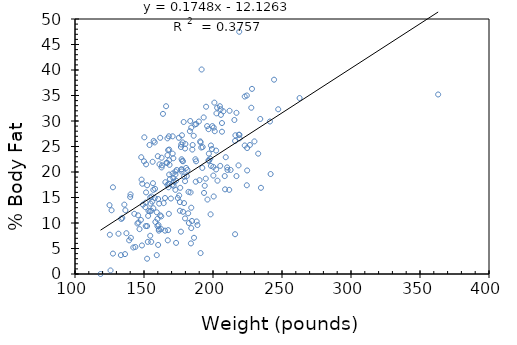
| Category | Series 0 |
|---|---|
| 154.25 | 12.3 |
| 173.25 | 6.1 |
| 154.0 | 25.3 |
| 184.75 | 10.4 |
| 184.25 | 28.7 |
| 210.25 | 20.9 |
| 181.0 | 19.2 |
| 176.0 | 12.4 |
| 191.0 | 4.1 |
| 198.25 | 11.7 |
| 186.25 | 7.1 |
| 216.0 | 7.8 |
| 180.5 | 20.8 |
| 205.25 | 21.2 |
| 187.75 | 22.1 |
| 162.75 | 20.9 |
| 195.75 | 29 |
| 209.25 | 22.9 |
| 183.75 | 16 |
| 211.75 | 16.5 |
| 179.0 | 19.1 |
| 200.5 | 15.2 |
| 140.25 | 15.6 |
| 148.75 | 17.7 |
| 151.25 | 14 |
| 159.25 | 3.7 |
| 131.5 | 7.9 |
| 148.0 | 22.9 |
| 133.25 | 3.7 |
| 160.75 | 8.8 |
| 182.0 | 11.9 |
| 160.25 | 5.7 |
| 168.0 | 11.8 |
| 218.5 | 21.3 |
| 247.25 | 32.3 |
| 191.75 | 40.1 |
| 202.25 | 24.2 |
| 196.75 | 28.4 |
| 363.15 | 35.2 |
| 203.0 | 32.6 |
| 262.75 | 34.5 |
| 205.0 | 32.9 |
| 217.0 | 31.6 |
| 212.0 | 32 |
| 125.25 | 7.7 |
| 164.25 | 13.9 |
| 133.5 | 10.8 |
| 148.5 | 5.6 |
| 135.75 | 13.6 |
| 127.5 | 4 |
| 158.25 | 10.2 |
| 139.25 | 6.6 |
| 137.25 | 8 |
| 152.75 | 6.3 |
| 136.25 | 3.9 |
| 198.0 | 22.6 |
| 181.5 | 20.4 |
| 201.25 | 28 |
| 202.5 | 31.5 |
| 179.75 | 24.6 |
| 216.0 | 26.1 |
| 178.75 | 29.8 |
| 193.25 | 30.7 |
| 178.0 | 25.8 |
| 205.5 | 32.3 |
| 183.5 | 30 |
| 151.5 | 21.5 |
| 154.75 | 13.8 |
| 155.25 | 6.3 |
| 156.75 | 12.9 |
| 167.5 | 24.3 |
| 146.75 | 8.8 |
| 160.75 | 8.5 |
| 125.0 | 13.5 |
| 143.0 | 11.8 |
| 148.25 | 18.5 |
| 162.5 | 8.8 |
| 177.75 | 22.2 |
| 161.25 | 21.5 |
| 171.25 | 18.8 |
| 163.75 | 31.4 |
| 150.25 | 26.8 |
| 190.25 | 18.4 |
| 170.75 | 27 |
| 168.0 | 27 |
| 167.0 | 26.6 |
| 157.75 | 14.9 |
| 160.0 | 23.1 |
| 176.75 | 8.3 |
| 176.0 | 14.1 |
| 177.0 | 20.5 |
| 179.75 | 18.2 |
| 165.25 | 8.5 |
| 192.5 | 24.9 |
| 184.25 | 9 |
| 224.5 | 17.4 |
| 188.75 | 9.6 |
| 162.5 | 11.3 |
| 156.5 | 17.8 |
| 197.0 | 22.2 |
| 198.5 | 21.2 |
| 173.75 | 20.4 |
| 172.75 | 20.1 |
| 196.75 | 22.3 |
| 177.0 | 25.4 |
| 165.5 | 18 |
| 200.25 | 19.3 |
| 203.25 | 18.3 |
| 194.0 | 17.3 |
| 168.5 | 21.4 |
| 170.75 | 19.7 |
| 183.25 | 28 |
| 178.25 | 22.1 |
| 163.0 | 21.3 |
| 175.25 | 26.7 |
| 158.0 | 16.7 |
| 177.25 | 20.1 |
| 179.0 | 13.9 |
| 191.0 | 25.8 |
| 187.5 | 18.1 |
| 206.5 | 27.9 |
| 185.25 | 25.3 |
| 160.25 | 14.7 |
| 151.5 | 16 |
| 161.0 | 13.8 |
| 167.0 | 17.5 |
| 177.5 | 27.2 |
| 152.25 | 17.4 |
| 192.25 | 20.8 |
| 165.25 | 14.9 |
| 171.75 | 18.1 |
| 171.25 | 22.7 |
| 197.0 | 23.6 |
| 157.0 | 26.1 |
| 168.25 | 24.4 |
| 186.0 | 27.1 |
| 166.75 | 21.8 |
| 187.75 | 29.4 |
| 168.25 | 22.3 |
| 212.75 | 20.4 |
| 176.75 | 24.9 |
| 173.25 | 18.3 |
| 167.0 | 23.3 |
| 159.75 | 9.4 |
| 188.15 | 10.3 |
| 156.0 | 14.2 |
| 208.5 | 19.2 |
| 206.5 | 29.6 |
| 143.75 | 5.3 |
| 223.0 | 25.2 |
| 152.25 | 9.4 |
| 241.75 | 19.6 |
| 146.0 | 10.1 |
| 156.75 | 16.5 |
| 200.25 | 21 |
| 171.5 | 17.3 |
| 205.75 | 31.2 |
| 182.5 | 10 |
| 136.5 | 12.5 |
| 177.25 | 22.5 |
| 151.25 | 9.4 |
| 196.0 | 14.6 |
| 184.25 | 13 |
| 140.0 | 15.1 |
| 218.75 | 27.3 |
| 217.0 | 19.2 |
| 166.25 | 21.8 |
| 224.75 | 20.3 |
| 228.25 | 36.3 |
| 172.75 | 16.5 |
| 152.25 | 3 |
| 125.75 | 0.7 |
| 177.25 | 20.5 |
| 176.25 | 16.9 |
| 226.75 | 25.3 |
| 145.25 | 9.9 |
| 151.0 | 13.1 |
| 241.25 | 29.9 |
| 187.25 | 22.5 |
| 234.75 | 16.9 |
| 219.25 | 26.6 |
| 118.5 | 0 |
| 145.75 | 11.5 |
| 159.25 | 12.1 |
| 170.5 | 17.5 |
| 167.5 | 8.6 |
| 232.75 | 23.6 |
| 210.5 | 20.4 |
| 202.25 | 20.5 |
| 185.0 | 24.4 |
| 153.0 | 11.4 |
| 244.25 | 38.1 |
| 193.5 | 15.9 |
| 224.75 | 24.7 |
| 162.75 | 22.8 |
| 180.0 | 25.5 |
| 156.25 | 22 |
| 168.0 | 17.7 |
| 167.25 | 6.6 |
| 170.75 | 23.6 |
| 178.25 | 12.2 |
| 150.0 | 22.1 |
| 200.5 | 28.7 |
| 184.0 | 6 |
| 223.0 | 34.8 |
| 208.75 | 16.6 |
| 166.0 | 32.9 |
| 195.0 | 32.8 |
| 160.5 | 9.6 |
| 159.75 | 10.8 |
| 140.5 | 7.1 |
| 216.25 | 27.2 |
| 168.25 | 19.5 |
| 194.75 | 18.7 |
| 172.75 | 19.5 |
| 219.0 | 47.5 |
| 149.25 | 13.6 |
| 154.5 | 7.5 |
| 199.25 | 24.5 |
| 154.5 | 15 |
| 153.25 | 12.4 |
| 230.0 | 26 |
| 161.75 | 11.5 |
| 142.25 | 5.2 |
| 179.75 | 10.9 |
| 126.5 | 12.5 |
| 169.5 | 14.8 |
| 198.5 | 25.2 |
| 174.5 | 14.9 |
| 167.75 | 17 |
| 147.75 | 10.6 |
| 182.25 | 16.1 |
| 175.5 | 15.4 |
| 161.75 | 26.7 |
| 157.75 | 25.8 |
| 168.75 | 18.6 |
| 191.5 | 24.8 |
| 219.15 | 27.3 |
| 155.25 | 12.4 |
| 189.75 | 29.9 |
| 127.5 | 17 |
| 224.5 | 35 |
| 234.25 | 30.4 |
| 227.75 | 32.6 |
| 199.5 | 29 |
| 155.5 | 15.2 |
| 215.5 | 30.2 |
| 134.25 | 11 |
| 201.0 | 33.6 |
| 186.75 | 29.3 |
| 190.75 | 26 |
| 207.5 | 31.9 |